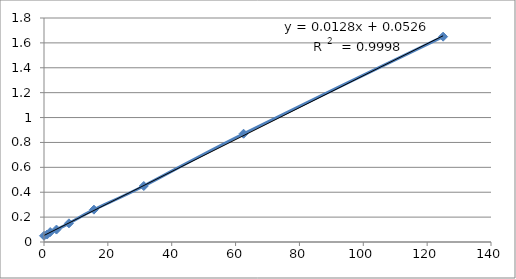
| Category | Series 0 |
|---|---|
| 125.0 | 1.65 |
| 62.5 | 0.87 |
| 31.25 | 0.45 |
| 15.63 | 0.26 |
| 7.81 | 0.15 |
| 3.91 | 0.1 |
| 1.95 | 0.08 |
| 0.98 | 0.06 |
| 0.0 | 0.05 |